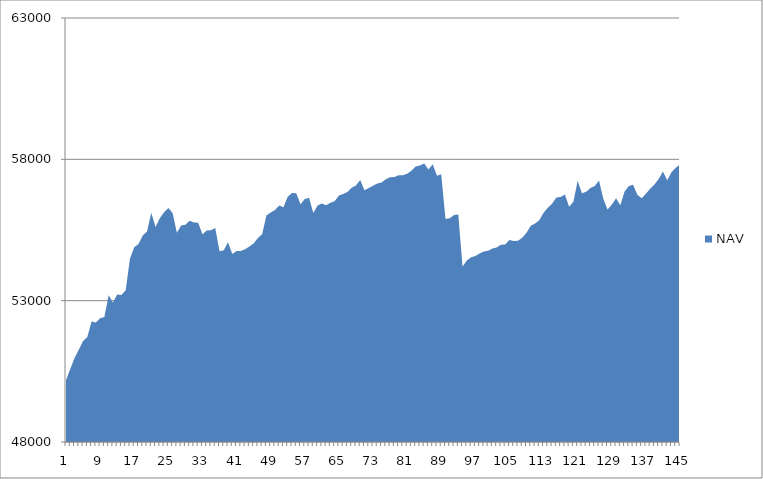
| Category | NAV |
|---|---|
| 0 | 50185.185 |
| 1 | 50585.185 |
| 2 | 50973.977 |
| 3 | 51265.977 |
| 4 | 51576.741 |
| 5 | 51711.523 |
| 6 | 52262.893 |
| 7 | 52230.24 |
| 8 | 52381.556 |
| 9 | 52425.915 |
| 10 | 53192.581 |
| 11 | 52939.146 |
| 12 | 53220.069 |
| 13 | 53197.341 |
| 14 | 53369.61 |
| 15 | 54480.721 |
| 16 | 54888.365 |
| 17 | 55001.902 |
| 18 | 55308.308 |
| 19 | 55448.308 |
| 20 | 56110.305 |
| 21 | 55610.305 |
| 22 | 55916.954 |
| 23 | 56129.798 |
| 24 | 56279.798 |
| 25 | 56105.301 |
| 26 | 55401.645 |
| 27 | 55657.201 |
| 28 | 55686.925 |
| 29 | 55823.001 |
| 30 | 55769.596 |
| 31 | 55759.375 |
| 32 | 55350.284 |
| 33 | 55480.284 |
| 34 | 55492.498 |
| 35 | 55570.42 |
| 36 | 54746.89 |
| 37 | 54783.7 |
| 38 | 55066.459 |
| 39 | 54651.074 |
| 40 | 54754.078 |
| 41 | 54760.213 |
| 42 | 54816.924 |
| 43 | 54917.296 |
| 44 | 55025.73 |
| 45 | 55220.535 |
| 46 | 55353.465 |
| 47 | 56009.309 |
| 48 | 56118.959 |
| 49 | 56205.212 |
| 50 | 56362.876 |
| 51 | 56307.394 |
| 52 | 56678.935 |
| 53 | 56813.264 |
| 54 | 56799.502 |
| 55 | 56409.112 |
| 56 | 56596.44 |
| 57 | 56640.493 |
| 58 | 56102.227 |
| 59 | 56370.449 |
| 60 | 56434.248 |
| 61 | 56376.841 |
| 62 | 56464.524 |
| 63 | 56518.022 |
| 64 | 56724.747 |
| 65 | 56770.361 |
| 66 | 56848.099 |
| 67 | 56992.896 |
| 68 | 57073.571 |
| 69 | 57266.481 |
| 70 | 56908.016 |
| 71 | 56984.939 |
| 72 | 57069.276 |
| 73 | 57147.627 |
| 74 | 57179.83 |
| 75 | 57291.17 |
| 76 | 57366.35 |
| 77 | 57371.599 |
| 78 | 57439.215 |
| 79 | 57440.895 |
| 80 | 57490.895 |
| 81 | 57593.679 |
| 82 | 57746.643 |
| 83 | 57785.413 |
| 84 | 57849.748 |
| 85 | 57639.346 |
| 86 | 57828.82 |
| 87 | 57417.055 |
| 88 | 57471.335 |
| 89 | 55888.376 |
| 90 | 55913.907 |
| 91 | 56031.989 |
| 92 | 56044.711 |
| 93 | 54210.631 |
| 94 | 54422.612 |
| 95 | 54536.647 |
| 96 | 54575.903 |
| 97 | 54670.229 |
| 98 | 54737.367 |
| 99 | 54762.386 |
| 100 | 54842.923 |
| 101 | 54881.385 |
| 102 | 54978.816 |
| 103 | 54991.283 |
| 104 | 55149.699 |
| 105 | 55109.498 |
| 106 | 55121.656 |
| 107 | 55227.569 |
| 108 | 55405.15 |
| 109 | 55650.183 |
| 110 | 55733.424 |
| 111 | 55846.244 |
| 112 | 56110.95 |
| 113 | 56283.172 |
| 114 | 56430.541 |
| 115 | 56648.489 |
| 116 | 56663.919 |
| 117 | 56752.272 |
| 118 | 56318.108 |
| 119 | 56496.442 |
| 120 | 57240.145 |
| 121 | 56797.081 |
| 122 | 56857.303 |
| 123 | 56985.874 |
| 124 | 57053.805 |
| 125 | 57249.117 |
| 126 | 56612.311 |
| 127 | 56221.507 |
| 128 | 56394.346 |
| 129 | 56622.008 |
| 130 | 56375.255 |
| 131 | 56862.384 |
| 132 | 57060.137 |
| 133 | 57099.524 |
| 134 | 56750.37 |
| 135 | 56622.71 |
| 136 | 56780.605 |
| 137 | 56961.84 |
| 138 | 57105.4 |
| 139 | 57301.96 |
| 140 | 57570.545 |
| 141 | 57256.886 |
| 142 | 57545.679 |
| 143 | 57705.679 |
| 144 | 57817.679 |